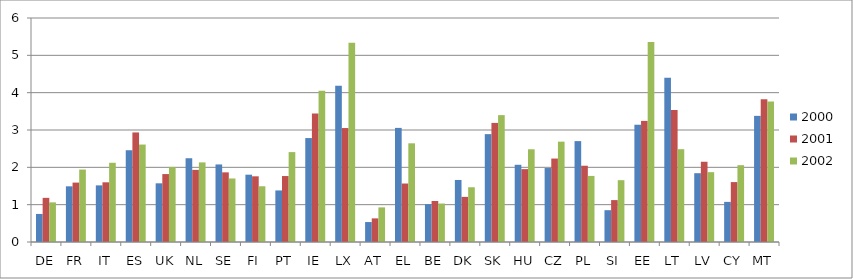
| Category | 2000 | 2001 | 2002 |
|---|---|---|---|
| DE | 0.752 | 1.182 | 1.061 |
| FR | 1.491 | 1.591 | 1.94 |
| IT | 1.517 | 1.599 | 2.122 |
| ES | 2.458 | 2.935 | 2.61 |
| UK | 1.572 | 1.82 | 2.01 |
| NL | 2.244 | 1.932 | 2.132 |
| SE | 2.077 | 1.866 | 1.701 |
| FI | 1.803 | 1.759 | 1.493 |
| PT | 1.381 | 1.767 | 2.408 |
| IE | 2.784 | 3.441 | 4.049 |
| LX | 4.188 | 3.053 | 5.338 |
| AT | 0.534 | 0.633 | 0.927 |
| EL | 3.056 | 1.566 | 2.644 |
| BE | 1.014 | 1.098 | 1.03 |
| DK | 1.662 | 1.209 | 1.467 |
| SK | 2.889 | 3.19 | 3.398 |
| HU | 2.068 | 1.952 | 2.484 |
| CZ | 1.981 | 2.235 | 2.687 |
| PL | 2.702 | 2.043 | 1.77 |
| SI | 0.852 | 1.122 | 1.656 |
| EE | 3.141 | 3.244 | 5.354 |
| LT | 4.4 | 3.534 | 2.486 |
| LV | 1.843 | 2.15 | 1.871 |
| CY | 1.074 | 1.605 | 2.058 |
| MT | 3.379 | 3.821 | 3.765 |